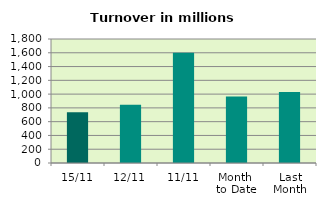
| Category | Series 0 |
|---|---|
| 15/11 | 737.087 |
| 12/11 | 844.155 |
| 11/11 | 1599.22 |
| Month 
to Date | 964.285 |
| Last
Month | 1032.218 |